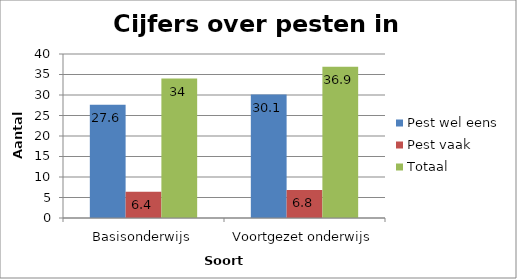
| Category | Pest wel eens | Pest vaak | Totaal |
|---|---|---|---|
| Basisonderwijs | 27.6 | 6.4 | 34 |
| Voortgezet onderwijs | 30.1 | 6.8 | 36.9 |